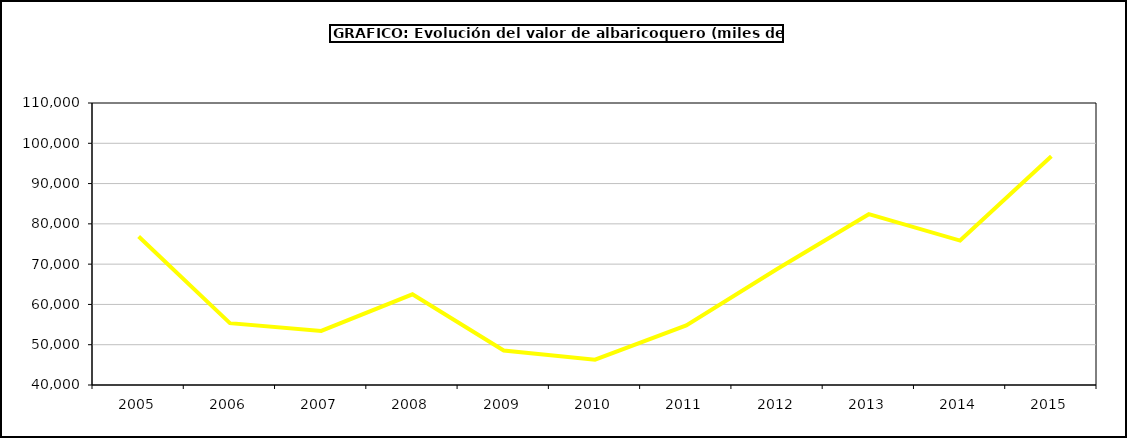
| Category | valor albaricoquero |
|---|---|
| 2005.0 | 76854.67 |
| 2006.0 | 55360.129 |
| 2007.0 | 53431.605 |
| 2008.0 | 62518.884 |
| 2009.0 | 48553.188 |
| 2010.0 | 46289.905 |
| 2011.0 | 54777.84 |
| 2012.0 | 68866.776 |
| 2013.0 | 82399.533 |
| 2014.0 | 75850.331 |
| 2015.0 | 96779 |